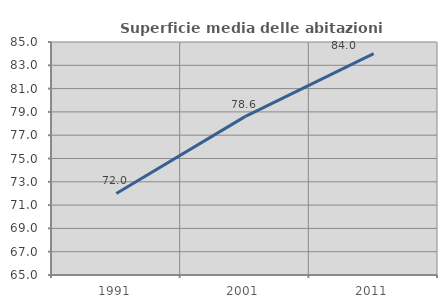
| Category | Superficie media delle abitazioni occupate |
|---|---|
| 1991.0 | 72 |
| 2001.0 | 78.597 |
| 2011.0 | 83.996 |